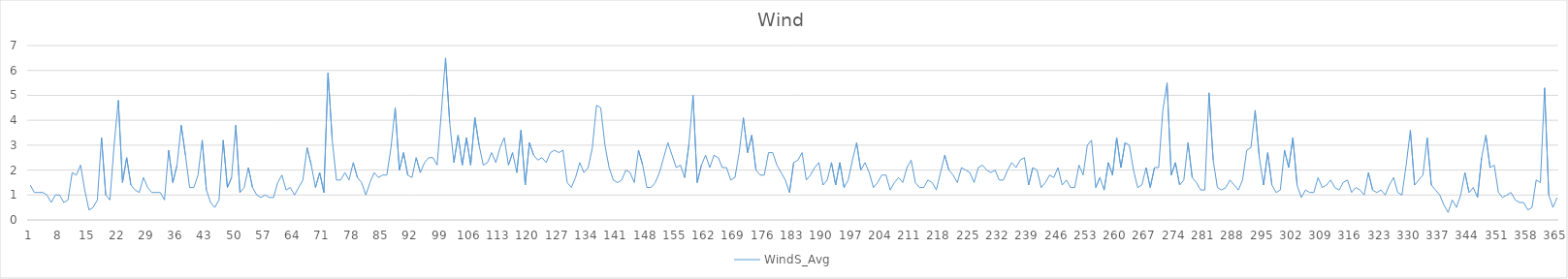
| Category | WindS_Avg |
|---|---|
| 0 | 1.4 |
| 1 | 1.1 |
| 2 | 1.1 |
| 3 | 1.1 |
| 4 | 1 |
| 5 | 0.7 |
| 6 | 1 |
| 7 | 1 |
| 8 | 0.7 |
| 9 | 0.8 |
| 10 | 1.9 |
| 11 | 1.8 |
| 12 | 2.2 |
| 13 | 1.2 |
| 14 | 0.4 |
| 15 | 0.5 |
| 16 | 0.8 |
| 17 | 3.3 |
| 18 | 1 |
| 19 | 0.8 |
| 20 | 3 |
| 21 | 4.8 |
| 22 | 1.5 |
| 23 | 2.5 |
| 24 | 1.4 |
| 25 | 1.2 |
| 26 | 1.1 |
| 27 | 1.7 |
| 28 | 1.3 |
| 29 | 1.1 |
| 30 | 1.1 |
| 31 | 1.1 |
| 32 | 0.8 |
| 33 | 2.8 |
| 34 | 1.5 |
| 35 | 2.2 |
| 36 | 3.8 |
| 37 | 2.6 |
| 38 | 1.3 |
| 39 | 1.3 |
| 40 | 1.8 |
| 41 | 3.2 |
| 42 | 1.2 |
| 43 | 0.7 |
| 44 | 0.5 |
| 45 | 0.8 |
| 46 | 3.2 |
| 47 | 1.3 |
| 48 | 1.7 |
| 49 | 3.8 |
| 50 | 1.1 |
| 51 | 1.3 |
| 52 | 2.1 |
| 53 | 1.3 |
| 54 | 1 |
| 55 | 0.9 |
| 56 | 1 |
| 57 | 0.9 |
| 58 | 0.9 |
| 59 | 1.5 |
| 60 | 1.8 |
| 61 | 1.2 |
| 62 | 1.3 |
| 63 | 1 |
| 64 | 1.3 |
| 65 | 1.6 |
| 66 | 2.9 |
| 67 | 2.2 |
| 68 | 1.3 |
| 69 | 1.9 |
| 70 | 1.1 |
| 71 | 5.9 |
| 72 | 3.2 |
| 73 | 1.6 |
| 74 | 1.6 |
| 75 | 1.9 |
| 76 | 1.6 |
| 77 | 2.3 |
| 78 | 1.7 |
| 79 | 1.5 |
| 80 | 1 |
| 81 | 1.5 |
| 82 | 1.9 |
| 83 | 1.7 |
| 84 | 1.8 |
| 85 | 1.8 |
| 86 | 2.9 |
| 87 | 4.5 |
| 88 | 2 |
| 89 | 2.7 |
| 90 | 1.8 |
| 91 | 1.7 |
| 92 | 2.5 |
| 93 | 1.9 |
| 94 | 2.3 |
| 95 | 2.5 |
| 96 | 2.5 |
| 97 | 2.2 |
| 98 | 4.3 |
| 99 | 6.5 |
| 100 | 3.9 |
| 101 | 2.3 |
| 102 | 3.4 |
| 103 | 2.2 |
| 104 | 3.3 |
| 105 | 2.2 |
| 106 | 4.1 |
| 107 | 3 |
| 108 | 2.2 |
| 109 | 2.3 |
| 110 | 2.7 |
| 111 | 2.3 |
| 112 | 2.9 |
| 113 | 3.3 |
| 114 | 2.2 |
| 115 | 2.7 |
| 116 | 1.9 |
| 117 | 3.6 |
| 118 | 1.4 |
| 119 | 3.1 |
| 120 | 2.6 |
| 121 | 2.4 |
| 122 | 2.5 |
| 123 | 2.3 |
| 124 | 2.7 |
| 125 | 2.8 |
| 126 | 2.7 |
| 127 | 2.8 |
| 128 | 1.5 |
| 129 | 1.3 |
| 130 | 1.7 |
| 131 | 2.3 |
| 132 | 1.9 |
| 133 | 2.1 |
| 134 | 2.9 |
| 135 | 4.6 |
| 136 | 4.5 |
| 137 | 3 |
| 138 | 2.1 |
| 139 | 1.6 |
| 140 | 1.5 |
| 141 | 1.6 |
| 142 | 2 |
| 143 | 1.9 |
| 144 | 1.5 |
| 145 | 2.8 |
| 146 | 2.2 |
| 147 | 1.3 |
| 148 | 1.3 |
| 149 | 1.5 |
| 150 | 1.9 |
| 151 | 2.5 |
| 152 | 3.1 |
| 153 | 2.6 |
| 154 | 2.1 |
| 155 | 2.2 |
| 156 | 1.7 |
| 157 | 3 |
| 158 | 5 |
| 159 | 1.5 |
| 160 | 2.2 |
| 161 | 2.6 |
| 162 | 2.1 |
| 163 | 2.6 |
| 164 | 2.5 |
| 165 | 2.1 |
| 166 | 2.1 |
| 167 | 1.6 |
| 168 | 1.7 |
| 169 | 2.7 |
| 170 | 4.1 |
| 171 | 2.7 |
| 172 | 3.4 |
| 173 | 2 |
| 174 | 1.8 |
| 175 | 1.8 |
| 176 | 2.7 |
| 177 | 2.7 |
| 178 | 2.2 |
| 179 | 1.9 |
| 180 | 1.6 |
| 181 | 1.1 |
| 182 | 2.3 |
| 183 | 2.4 |
| 184 | 2.7 |
| 185 | 1.6 |
| 186 | 1.8 |
| 187 | 2.1 |
| 188 | 2.3 |
| 189 | 1.4 |
| 190 | 1.6 |
| 191 | 2.3 |
| 192 | 1.4 |
| 193 | 2.3 |
| 194 | 1.3 |
| 195 | 1.6 |
| 196 | 2.4 |
| 197 | 3.1 |
| 198 | 2 |
| 199 | 2.3 |
| 200 | 1.9 |
| 201 | 1.3 |
| 202 | 1.5 |
| 203 | 1.8 |
| 204 | 1.8 |
| 205 | 1.2 |
| 206 | 1.5 |
| 207 | 1.7 |
| 208 | 1.5 |
| 209 | 2.1 |
| 210 | 2.4 |
| 211 | 1.5 |
| 212 | 1.3 |
| 213 | 1.3 |
| 214 | 1.6 |
| 215 | 1.5 |
| 216 | 1.2 |
| 217 | 1.9 |
| 218 | 2.6 |
| 219 | 2 |
| 220 | 1.8 |
| 221 | 1.5 |
| 222 | 2.1 |
| 223 | 2 |
| 224 | 1.9 |
| 225 | 1.5 |
| 226 | 2.1 |
| 227 | 2.2 |
| 228 | 2 |
| 229 | 1.9 |
| 230 | 2 |
| 231 | 1.6 |
| 232 | 1.6 |
| 233 | 2 |
| 234 | 2.3 |
| 235 | 2.1 |
| 236 | 2.4 |
| 237 | 2.5 |
| 238 | 1.4 |
| 239 | 2.1 |
| 240 | 2 |
| 241 | 1.3 |
| 242 | 1.5 |
| 243 | 1.8 |
| 244 | 1.7 |
| 245 | 2.1 |
| 246 | 1.4 |
| 247 | 1.6 |
| 248 | 1.3 |
| 249 | 1.3 |
| 250 | 2.2 |
| 251 | 1.8 |
| 252 | 3 |
| 253 | 3.2 |
| 254 | 1.3 |
| 255 | 1.7 |
| 256 | 1.2 |
| 257 | 2.3 |
| 258 | 1.8 |
| 259 | 3.3 |
| 260 | 2.1 |
| 261 | 3.1 |
| 262 | 3 |
| 263 | 2 |
| 264 | 1.3 |
| 265 | 1.4 |
| 266 | 2.1 |
| 267 | 1.3 |
| 268 | 2.1 |
| 269 | 2.1 |
| 270 | 4.4 |
| 271 | 5.5 |
| 272 | 1.8 |
| 273 | 2.3 |
| 274 | 1.4 |
| 275 | 1.6 |
| 276 | 3.1 |
| 277 | 1.7 |
| 278 | 1.5 |
| 279 | 1.2 |
| 280 | 1.2 |
| 281 | 5.1 |
| 282 | 2.4 |
| 283 | 1.3 |
| 284 | 1.2 |
| 285 | 1.3 |
| 286 | 1.6 |
| 287 | 1.4 |
| 288 | 1.2 |
| 289 | 1.6 |
| 290 | 2.8 |
| 291 | 2.9 |
| 292 | 4.4 |
| 293 | 2.5 |
| 294 | 1.4 |
| 295 | 2.7 |
| 296 | 1.4 |
| 297 | 1.1 |
| 298 | 1.2 |
| 299 | 2.8 |
| 300 | 2.1 |
| 301 | 3.3 |
| 302 | 1.4 |
| 303 | 0.9 |
| 304 | 1.2 |
| 305 | 1.1 |
| 306 | 1.1 |
| 307 | 1.7 |
| 308 | 1.3 |
| 309 | 1.4 |
| 310 | 1.6 |
| 311 | 1.3 |
| 312 | 1.2 |
| 313 | 1.5 |
| 314 | 1.6 |
| 315 | 1.1 |
| 316 | 1.3 |
| 317 | 1.2 |
| 318 | 1 |
| 319 | 1.9 |
| 320 | 1.2 |
| 321 | 1.1 |
| 322 | 1.2 |
| 323 | 1 |
| 324 | 1.4 |
| 325 | 1.7 |
| 326 | 1.1 |
| 327 | 1 |
| 328 | 2.2 |
| 329 | 3.6 |
| 330 | 1.4 |
| 331 | 1.6 |
| 332 | 1.8 |
| 333 | 3.3 |
| 334 | 1.4 |
| 335 | 1.2 |
| 336 | 1 |
| 337 | 0.6 |
| 338 | 0.3 |
| 339 | 0.8 |
| 340 | 0.5 |
| 341 | 1 |
| 342 | 1.9 |
| 343 | 1.1 |
| 344 | 1.3 |
| 345 | 0.9 |
| 346 | 2.5 |
| 347 | 3.4 |
| 348 | 2.1 |
| 349 | 2.2 |
| 350 | 1.1 |
| 351 | 0.9 |
| 352 | 1 |
| 353 | 1.1 |
| 354 | 0.8 |
| 355 | 0.7 |
| 356 | 0.7 |
| 357 | 0.4 |
| 358 | 0.5 |
| 359 | 1.6 |
| 360 | 1.5 |
| 361 | 5.3 |
| 362 | 1 |
| 363 | 0.5 |
| 364 | 0.9 |